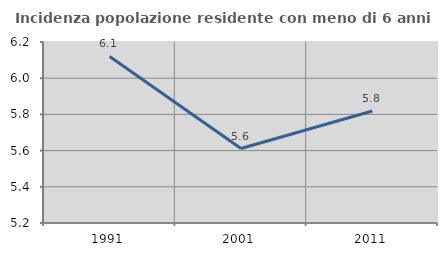
| Category | Incidenza popolazione residente con meno di 6 anni |
|---|---|
| 1991.0 | 6.12 |
| 2001.0 | 5.611 |
| 2011.0 | 5.819 |